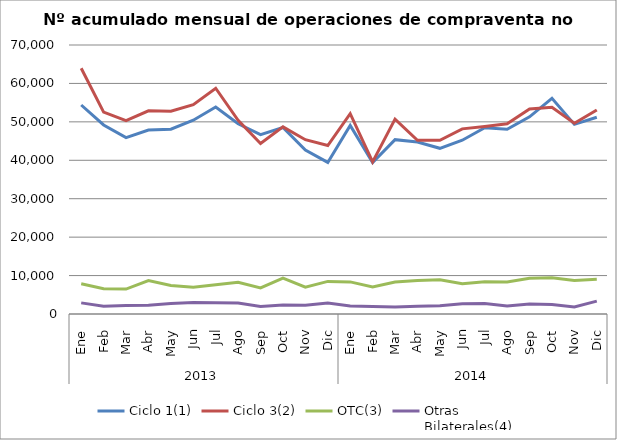
| Category | Ciclo 1(1) | Ciclo 3(2) | OTC(3) | Otras
Bilaterales(4) |
|---|---|---|---|---|
| 0 | 54386 | 63960 | 7873 | 2891 |
| 1 | 49196 | 52525 | 6550 | 2012 |
| 2 | 45892 | 50320 | 6475 | 2233 |
| 3 | 47876 | 52874 | 8686 | 2274 |
| 4 | 48091 | 52767 | 7394 | 2733 |
| 5 | 50415 | 54485 | 6994 | 3021 |
| 6 | 53879 | 58744 | 7586 | 2959 |
| 7 | 49504 | 50401 | 8243 | 2889 |
| 8 | 46688 | 44370 | 6784 | 1951 |
| 9 | 48531 | 48693 | 9357 | 2324 |
| 10 | 42642 | 45362 | 7000 | 2275 |
| 11 | 39447 | 43831 | 8487 | 2831 |
| 12 | 49087 | 52117 | 8357 | 2090 |
| 13 | 39397 | 39565 | 7045 | 1958 |
| 14 | 45373 | 50721 | 8313 | 1843 |
| 15 | 44744 | 45214 | 8739 | 2016 |
| 16 | 43118 | 45196 | 8896 | 2164 |
| 17 | 45225 | 48182 | 7881 | 2648 |
| 18 | 48478 | 48790 | 8413 | 2759 |
| 19 | 48087 | 49488 | 8324 | 2057 |
| 20 | 51316 | 53331 | 9278 | 2578 |
| 21 | 56122 | 53821 | 9408 | 2468 |
| 22 | 49342 | 49623 | 8715 | 1847 |
| 23 | 51202 | 53100 | 9049 | 3354 |